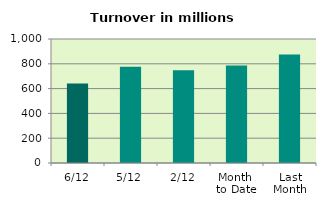
| Category | Series 0 |
|---|---|
| 6/12 | 641.246 |
| 5/12 | 777.065 |
| 2/12 | 748.761 |
| Month 
to Date | 786.765 |
| Last
Month | 874.327 |